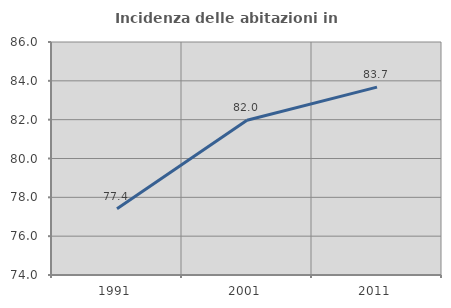
| Category | Incidenza delle abitazioni in proprietà  |
|---|---|
| 1991.0 | 77.417 |
| 2001.0 | 81.966 |
| 2011.0 | 83.677 |